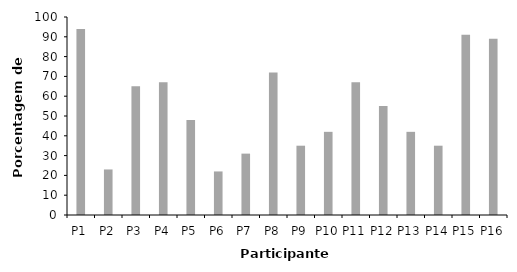
| Category | Series 0 |
|---|---|
| P1 | 94 |
| P2 | 23 |
| P3 | 65 |
| P4 | 67 |
| P5 | 48 |
| P6 | 22 |
| P7 | 31 |
| P8 | 72 |
| P9 | 35 |
| P10 | 42 |
| P11 | 67 |
| P12 | 55 |
| P13 | 42 |
| P14 | 35 |
| P15 | 91 |
| P16 | 89 |